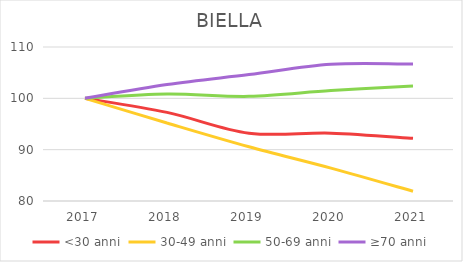
| Category | <30 anni | 30-49 anni | 50-69 anni | ≥70 anni |
|---|---|---|---|---|
| 2017.0 | 100 | 100 | 100 | 100 |
| 2018.0 | 97.258 | 95.199 | 100.845 | 102.684 |
| 2019.0 | 93.218 | 90.567 | 100.39 | 104.636 |
| 2020.0 | 93.218 | 86.41 | 101.507 | 106.629 |
| 2021.0 | 92.208 | 81.897 | 102.391 | 106.669 |